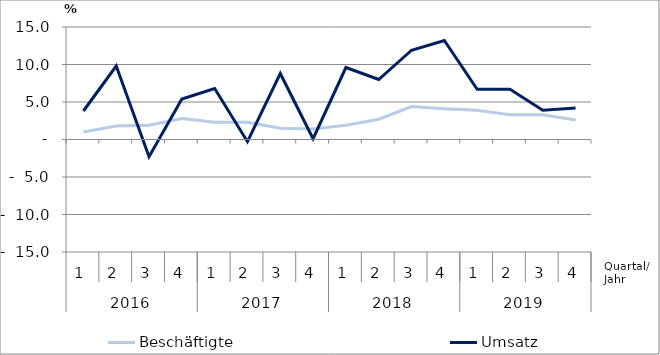
| Category | Beschäftigte | Umsatz |
|---|---|---|
| 0 | 1 | 3.8 |
| 1 | 1.8 | 9.8 |
| 2 | 1.9 | -2.3 |
| 3 | 2.8 | 5.4 |
| 4 | 2.3 | 6.8 |
| 5 | 2.3 | -0.3 |
| 6 | 1.5 | 8.8 |
| 7 | 1.4 | 0.1 |
| 8 | 1.9 | 9.6 |
| 9 | 2.7 | 8 |
| 10 | 4.4 | 11.9 |
| 11 | 4.1 | 13.2 |
| 12 | 3.9 | 6.7 |
| 13 | 3.3 | 6.7 |
| 14 | 3.3 | 3.9 |
| 15 | 2.6 | 4.2 |